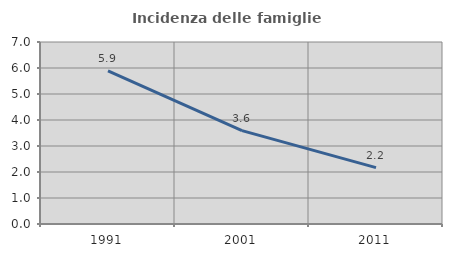
| Category | Incidenza delle famiglie numerose |
|---|---|
| 1991.0 | 5.89 |
| 2001.0 | 3.592 |
| 2011.0 | 2.168 |